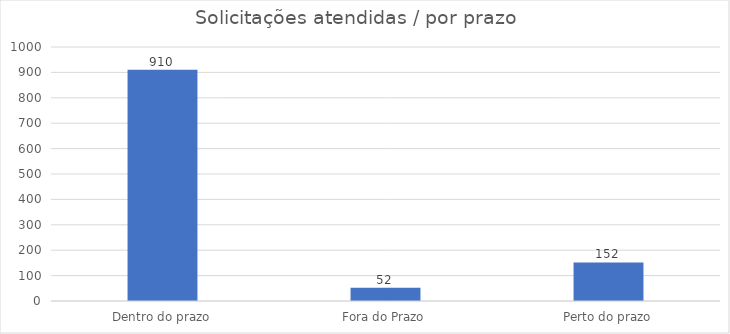
| Category | Series 0 |
|---|---|
| Dentro do prazo | 910 |
| Fora do Prazo | 52 |
| Perto do prazo | 152 |